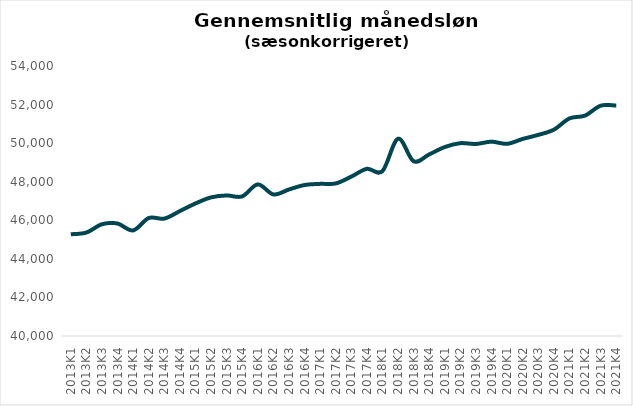
| Category | Series 0 |
|---|---|
| 2013K1 | 45275.324 |
| 2013K2 | 45365.391 |
| 2013K3 | 45794.938 |
| 2013K4 | 45830.565 |
| 2014K1 | 45475.33 |
| 2014K2 | 46116.606 |
| 2014K3 | 46088.14 |
| 2014K4 | 46476.438 |
| 2015K1 | 46872.549 |
| 2015K2 | 47187.169 |
| 2015K3 | 47287.886 |
| 2015K4 | 47238.514 |
| 2016K1 | 47860.236 |
| 2016K2 | 47342.065 |
| 2016K3 | 47597.128 |
| 2016K4 | 47828.641 |
| 2017K1 | 47888.582 |
| 2017K2 | 47910.971 |
| 2017K3 | 48261.991 |
| 2017K4 | 48666.915 |
| 2018K1 | 48552.979 |
| 2018K2 | 50228.224 |
| 2018K3 | 49062.662 |
| 2018K4 | 49415.101 |
| 2019K1 | 49798.741 |
| 2019K2 | 49998.042 |
| 2019K3 | 49958.465 |
| 2019K4 | 50076.287 |
| 2020K1 | 49964.982 |
| 2020K2 | 50218.128 |
| 2020K3 | 50428.868 |
| 2020K4 | 50699.011 |
| 2021K1 | 51281.519 |
| 2021K2 | 51429.695 |
| 2021K3 | 51941.018 |
| 2021K4 | 51948.931 |